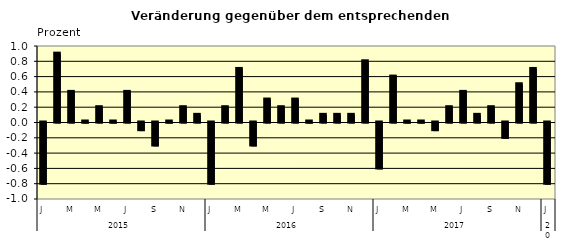
| Category | Series 0 |
|---|---|
| 0 | -0.8 |
| 1 | 0.9 |
| 2 | 0.4 |
| 3 | 0.01 |
| 4 | 0.2 |
| 5 | 0.01 |
| 6 | 0.4 |
| 7 | -0.1 |
| 8 | -0.3 |
| 9 | 0.01 |
| 10 | 0.2 |
| 11 | 0.1 |
| 12 | -0.8 |
| 13 | 0.2 |
| 14 | 0.7 |
| 15 | -0.3 |
| 16 | 0.3 |
| 17 | 0.2 |
| 18 | 0.3 |
| 19 | 0.01 |
| 20 | 0.1 |
| 21 | 0.1 |
| 22 | 0.1 |
| 23 | 0.8 |
| 24 | -0.6 |
| 25 | 0.6 |
| 26 | 0.01 |
| 27 | 0.01 |
| 28 | -0.1 |
| 29 | 0.2 |
| 30 | 0.4 |
| 31 | 0.1 |
| 32 | 0.2 |
| 33 | -0.2 |
| 34 | 0.5 |
| 35 | 0.7 |
| 36 | -0.8 |